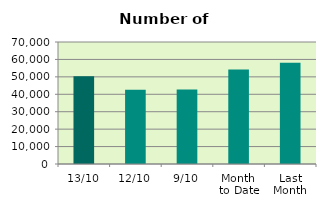
| Category | Series 0 |
|---|---|
| 13/10 | 50408 |
| 12/10 | 42566 |
| 9/10 | 42680 |
| Month 
to Date | 54287.111 |
| Last
Month | 58072.091 |